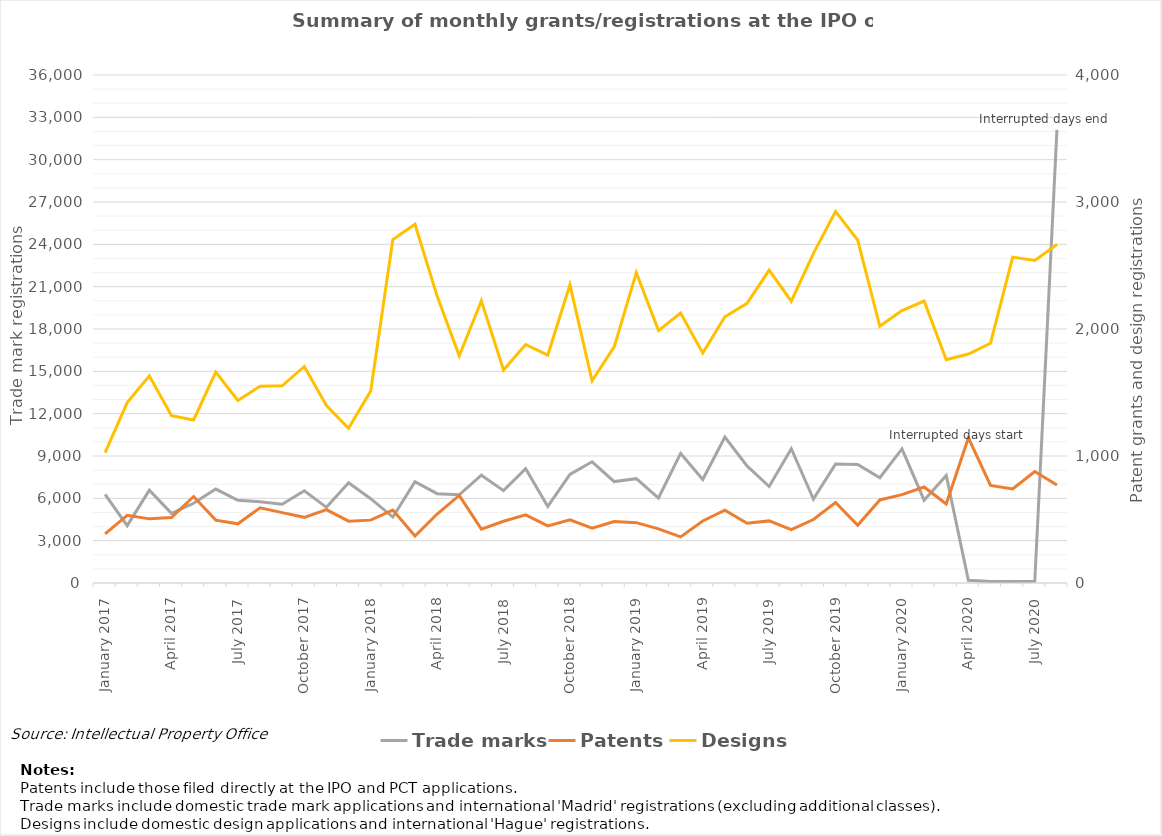
| Category | Trade marks |
|---|---|
| January 2017 | 6287 |
| February 2017 | 4063 |
| March 2017 | 6576 |
| April 2017 | 4937 |
| May 2017 | 5651 |
| June 2017 | 6658 |
| July 2017 | 5857 |
| August 2017 | 5763 |
| September 2017 | 5578 |
| October 2017 | 6538 |
| November 2017 | 5362 |
| December 2017 | 7101 |
| January 2018 | 5977 |
| February 2018 | 4670 |
| March 2018 | 7176 |
| April 2018 | 6332 |
| May 2018 | 6251 |
| June 2018 | 7636 |
| July 2018 | 6546 |
| August 2018 | 8099 |
| September 2018 | 5426 |
| October 2018 | 7698 |
| November 2018 | 8590 |
| December 2018 | 7188 |
| January 2019 | 7393 |
| February 2019 | 6021 |
| March 2019 | 9184 |
| April 2019 | 7333 |
| May 2019 | 10342 |
| June 2019 | 8301 |
| July 2019 | 6839 |
| August 2019 | 9513 |
| September 2019 | 5942 |
| October 2019 | 8434 |
| November 2019 | 8397 |
| December 2019 | 7464 |
| January 2020 | 9501 |
| February 2020 | 5867 |
| March 2020 | 7622 |
| April 2020 | 190 |
| May 2020 | 103 |
| June 2020 | 101 |
| July 2020 | 129 |